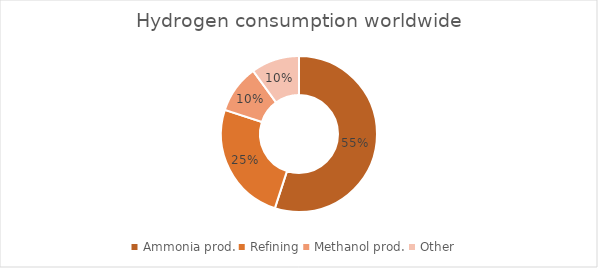
| Category | Series 0 |
|---|---|
| Ammonia prod. | 0.55 |
| Refining | 0.25 |
| Methanol prod. | 0.1 |
| Other | 0.1 |